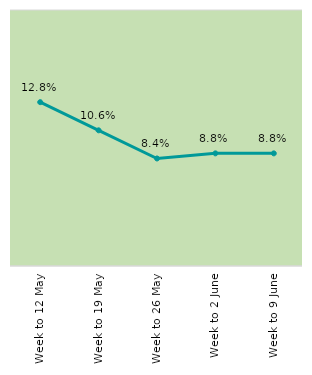
| Category | Series 0 |
|---|---|
| Week to 12 May | 0.128 |
| Week to 19 May | 0.106 |
| Week to 26 May | 0.084 |
| Week to 2 June | 0.088 |
| Week to 9 June | 0.088 |